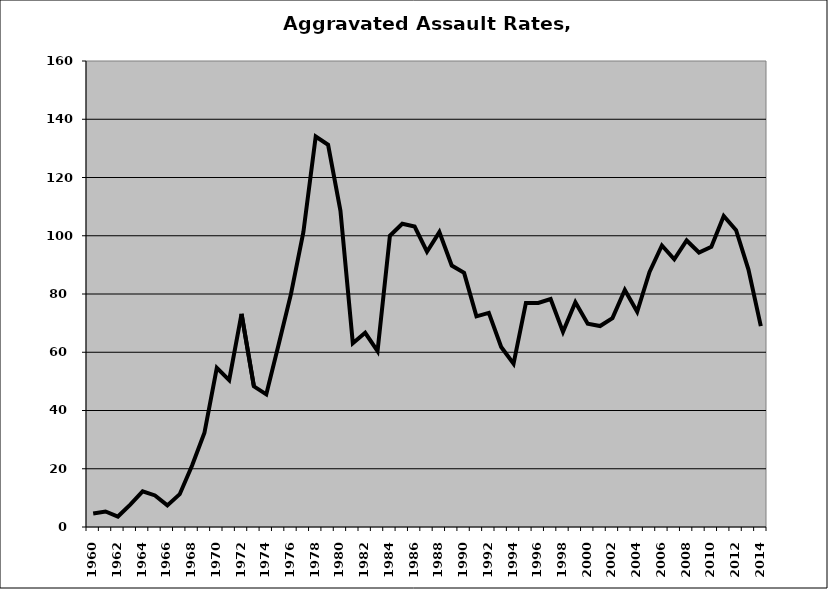
| Category | Aggravated Assault |
|---|---|
| 1960.0 | 4.617 |
| 1961.0 | 5.316 |
| 1962.0 | 3.59 |
| 1963.0 | 7.692 |
| 1964.0 | 12.225 |
| 1965.0 | 10.831 |
| 1966.0 | 7.407 |
| 1967.0 | 11.271 |
| 1968.0 | 21.09 |
| 1969.0 | 32.346 |
| 1970.0 | 54.64 |
| 1971.0 | 50.437 |
| 1972.0 | 73.16 |
| 1973.0 | 48.276 |
| 1974.0 | 45.532 |
| 1975.0 | 62.633 |
| 1976.0 | 80.042 |
| 1977.0 | 101.242 |
| 1978.0 | 134.086 |
| 1979.0 | 131.237 |
| 1980.0 | 108.547 |
| 1981.0 | 63.107 |
| 1982.0 | 66.667 |
| 1983.0 | 60.381 |
| 1984.0 | 100 |
| 1985.0 | 104.112 |
| 1986.0 | 103.142 |
| 1987.0 | 94.526 |
| 1988.0 | 101.259 |
| 1989.0 | 89.771 |
| 1990.0 | 87.249 |
| 1991.0 | 72.31 |
| 1992.0 | 73.509 |
| 1993.0 | 61.806 |
| 1994.0 | 56.034 |
| 1995.0 | 76.923 |
| 1996.0 | 76.91 |
| 1997.0 | 78.268 |
| 1998.0 | 67.005 |
| 1999.0 | 77.138 |
| 2000.0 | 69.806 |
| 2001.0 | 69.007 |
| 2002.0 | 71.706 |
| 2003.0 | 81.377 |
| 2004.0 | 73.885 |
| 2005.0 | 87.566 |
| 2006.0 | 96.649 |
| 2007.0 | 91.911 |
| 2008.0 | 98.382 |
| 2009.0 | 94.249 |
| 2010.0 | 96.206 |
| 2011.0 | 106.768 |
| 2012.0 | 101.925 |
| 2013.0 | 88.378 |
| 2014.0 | 68.948 |